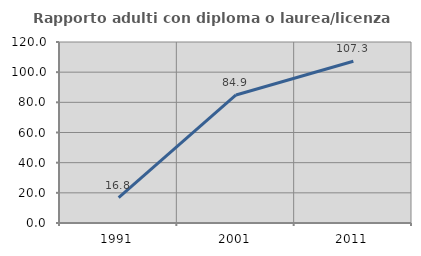
| Category | Rapporto adulti con diploma o laurea/licenza media  |
|---|---|
| 1991.0 | 16.759 |
| 2001.0 | 84.889 |
| 2011.0 | 107.26 |